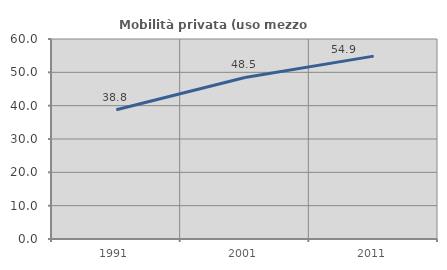
| Category | Mobilità privata (uso mezzo privato) |
|---|---|
| 1991.0 | 38.798 |
| 2001.0 | 48.469 |
| 2011.0 | 54.857 |